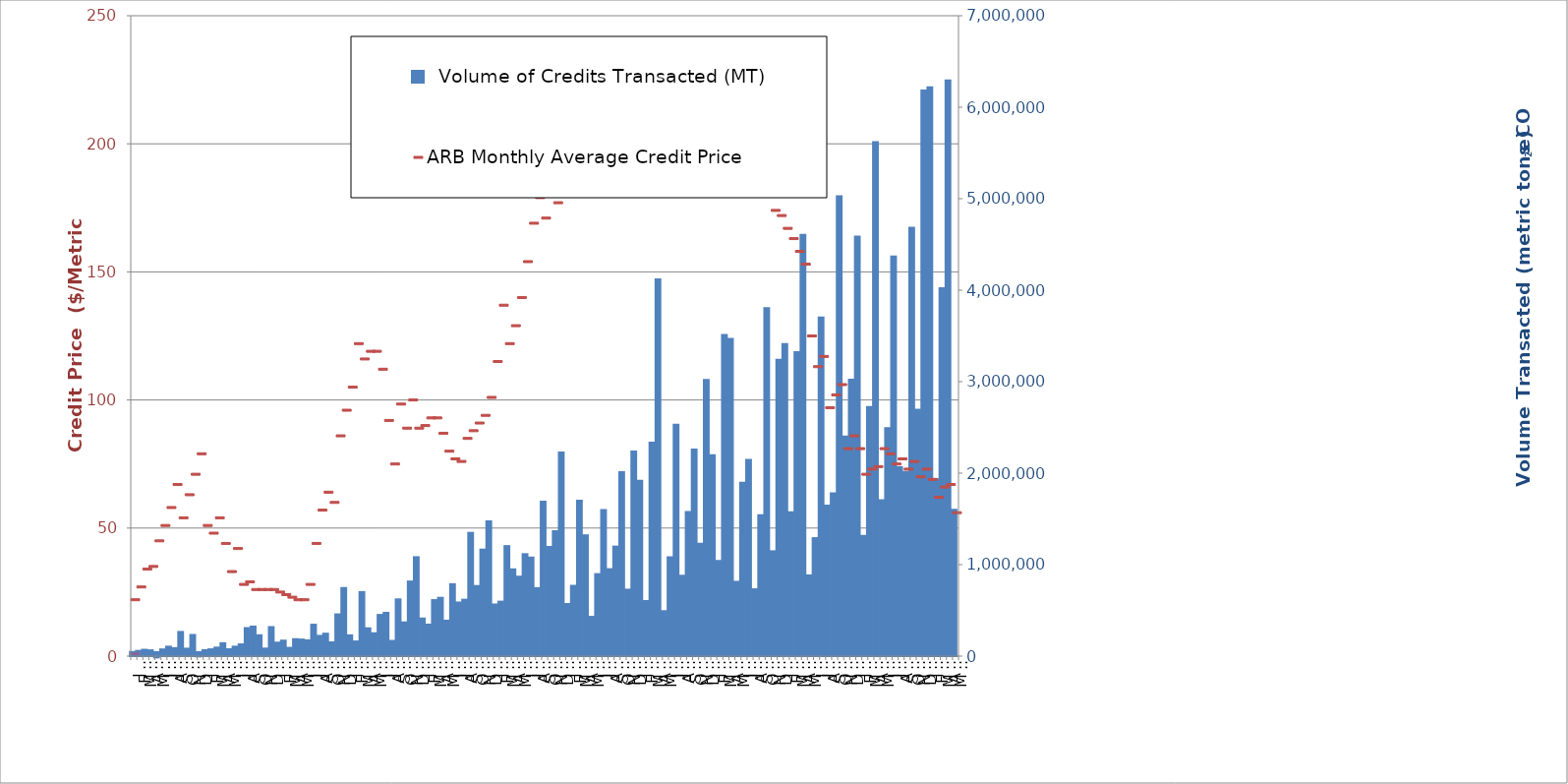
| Category |   Volume of Credits Transacted (MT) |
|---|---|
| 0 | 24000 |
| 1 | 36000 |
| 2 | 48000 |
| 3 | 42000 |
| 4 | 7000 |
| 5 | 52000 |
| 6 | 82000 |
| 7 | 66000 |
| 8 | 243000 |
| 9 | 60000 |
| 10 | 210000 |
| 11 | 18000 |
| 12 | 43000 |
| 13 | 53000 |
| 14 | 72000 |
| 15 | 120000 |
| 16 | 54000 |
| 17 | 82000 |
| 18 | 107000 |
| 19 | 285000 |
| 20 | 301000 |
| 21 | 207000 |
| 22 | 61000 |
| 23 | 296000 |
| 24 | 126000 |
| 25 | 148000 |
| 26 | 69000 |
| 27 | 164000 |
| 28 | 160000 |
| 29 | 151000 |
| 30 | 322000 |
| 31 | 200000 |
| 32 | 224000 |
| 33 | 129000 |
| 34 | 435000 |
| 35 | 723000 |
| 36 | 206000 |
| 37 | 139000 |
| 38 | 679000 |
| 39 | 283000 |
| 40 | 229000 |
| 41 | 429000 |
| 42 | 452000 |
| 43 | 145000 |
| 44 | 599000 |
| 45 | 347000 |
| 46 | 794000 |
| 47 | 1060000 |
| 48 | 390000 |
| 49 | 323000 |
| 50 | 591000 |
| 51 | 616000 |
| 52 | 366000 |
| 53 | 765000 |
| 54 | 565000 |
| 55 | 595000 |
| 56 | 1326000 |
| 57 | 745000 |
| 58 | 1143000 |
| 59 | 1451000 |
| 60 | 543000 |
| 61 | 574000 |
| 62 | 1181000 |
| 63 | 927000 |
| 64 | 847000 |
| 65 | 1093000 |
| 66 | 1056000 |
| 67 | 722000 |
| 68 | 1668000 |
| 69 | 1172000 |
| 70 | 1345000 |
| 71 | 2205000 |
| 72 | 548000 |
| 73 | 747000 |
| 74 | 1677000 |
| 75 | 1299000 |
| 76 | 408000 |
| 77 | 875000 |
| 78 | 1574000 |
| 79 | 929000 |
| 80 | 1176000 |
| 81 | 1990000 |
| 82 | 705000 |
| 83 | 2216000 |
| 84 | 1895000 |
| 85 | 581000 |
| 86 | 2312000 |
| 87 | 4098000 |
| 88 | 470000 |
| 89 | 1059000 |
| 90 | 2509000 |
| 91 | 857000 |
| 92 | 1553000 |
| 93 | 2237000 |
| 94 | 1207000 |
| 95 | 2997000 |
| 96 | 2176000 |
| 97 | 1019000 |
| 98 | 3490000 |
| 99 | 3445000 |
| 100 | 791000 |
| 101 | 1873000 |
| 102 | 2125000 |
| 103 | 709000 |
| 104 | 1518000 |
| 105 | 3782000 |
| 106 | 1125000 |
| 107 | 3217000 |
| 108 | 3389000 |
| 109 | 1550000 |
| 110 | 3301000 |
| 111 | 4584000 |
| 112 | 861000 |
| 113 | 1268000 |
| 114 | 3680000 |
| 115 | 1624000 |
| 116 | 1759000 |
| 117 | 5005000 |
| 118 | 2379000 |
| 119 | 3001000 |
| 120 | 4564000 |
| 121 | 1293000 |
| 122 | 2702000 |
| 123 | 5596000 |
| 124 | 1684000 |
| 125 | 2470000 |
| 126 | 4347000 |
| 127 | 2044000 |
| 128 | 1993000 |
| 129 | 4661000 |
| 130 | 2672000 |
| 131 | 6161000 |
| 132 | 6196000 |
| 133 | 1911000 |
| 134 | 3999000 |
| 135 | 6271000 |
| 136 | 1577000 |